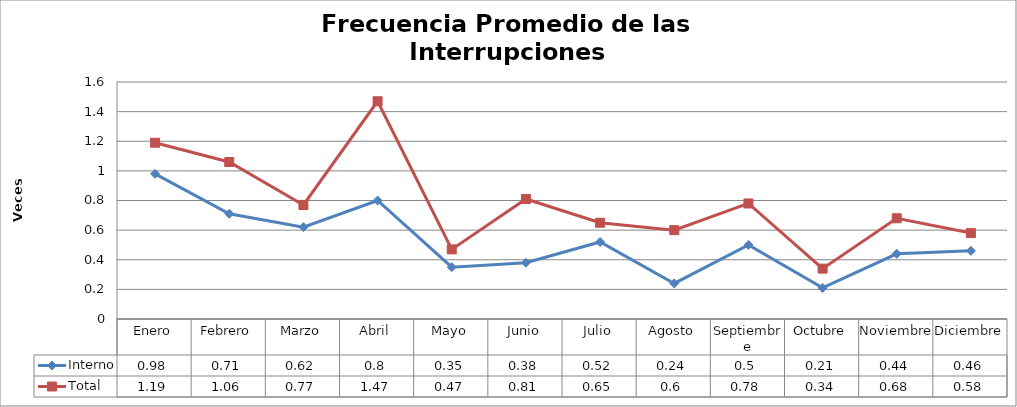
| Category | Interno | Total |
|---|---|---|
| Enero | 0.98 | 1.19 |
| Febrero | 0.71 | 1.06 |
| Marzo | 0.62 | 0.77 |
| Abril | 0.8 | 1.47 |
| Mayo | 0.35 | 0.47 |
| Junio | 0.38 | 0.81 |
| Julio | 0.52 | 0.65 |
| Agosto | 0.24 | 0.6 |
| Septiembre | 0.5 | 0.78 |
| Octubre | 0.21 | 0.34 |
| Noviembre | 0.44 | 0.68 |
| Diciembre | 0.46 | 0.58 |